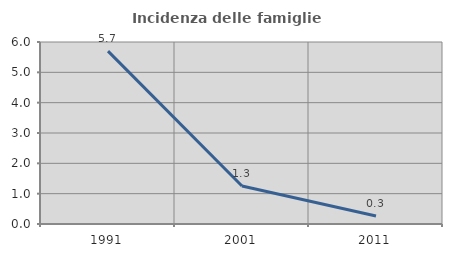
| Category | Incidenza delle famiglie numerose |
|---|---|
| 1991.0 | 5.699 |
| 2001.0 | 1.253 |
| 2011.0 | 0.262 |